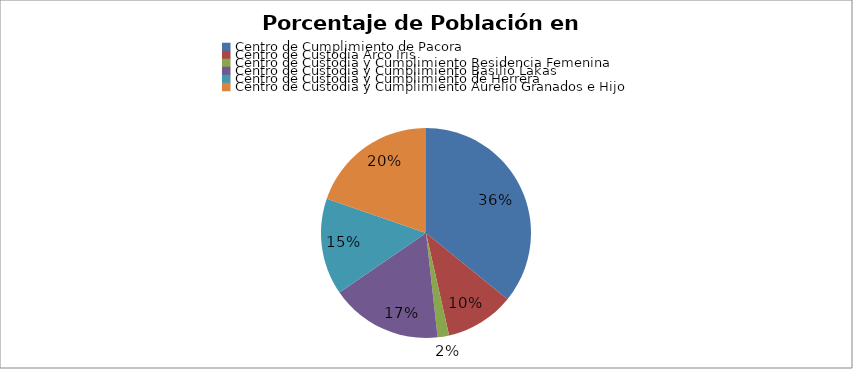
| Category | Series 0 |
|---|---|
| Centro de Cumplimiento de Pacora | 142 |
| Centro de Custodia Arco Iris | 42 |
| Centro de Custodia y Cumplimiento Residencia Femenina | 7 |
| Centro de Custodia y Cumplimiento Basilio Lakas | 68 |
| Centro de Custodia y Cumplimiento de Herrera | 59 |
| Centro de Custodia y Cumplimiento Aurelio Granados e Hijo | 78 |